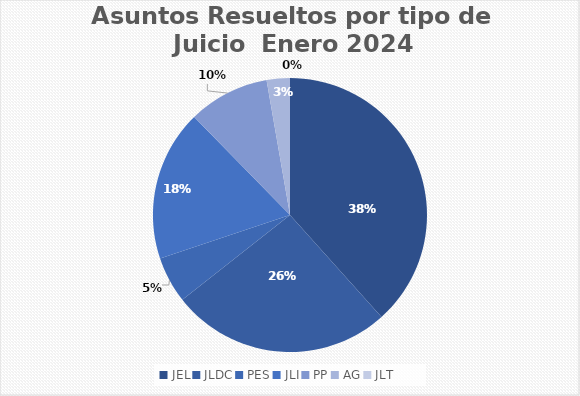
| Category | Asuntos Resueltos por tipo de Juicio  ENERO |
|---|---|
| JEL | 28 |
| JLDC | 19 |
| PES | 4 |
| JLI | 13 |
| PP | 7 |
| AG | 2 |
| JLT | 0 |